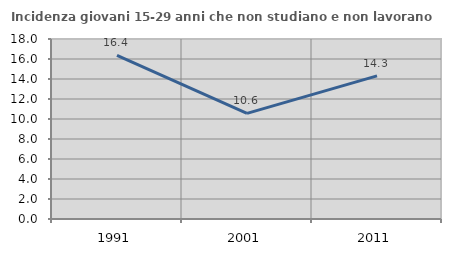
| Category | Incidenza giovani 15-29 anni che non studiano e non lavorano  |
|---|---|
| 1991.0 | 16.364 |
| 2001.0 | 10.565 |
| 2011.0 | 14.312 |